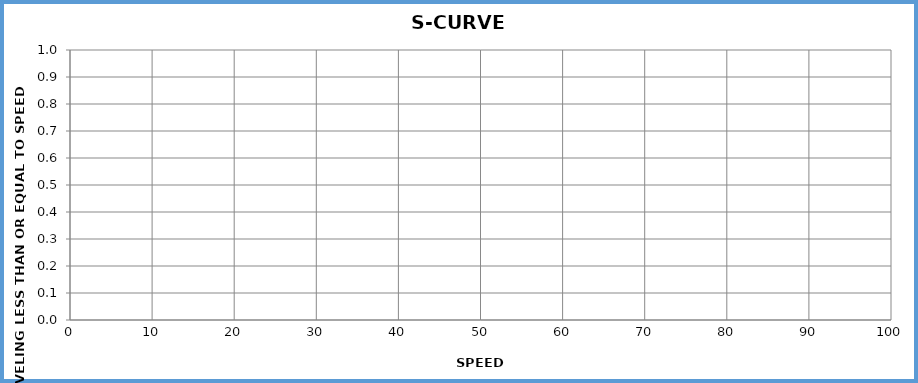
| Category | S-Curve Plot |
|---|---|
| 15.0 | 0 |
| 16.0 | 0 |
| 17.0 | 0 |
| 18.0 | 0 |
| 19.0 | 0 |
| 20.0 | 0 |
| 21.0 | 0 |
| 22.0 | 0 |
| 23.0 | 0 |
| 24.0 | 0 |
| 25.0 | 0 |
| 26.0 | 0 |
| 27.0 | 0 |
| 28.0 | 0 |
| 29.0 | 0 |
| 30.0 | 0 |
| 31.0 | 0 |
| 32.0 | 0 |
| 33.0 | 0 |
| 34.0 | 0 |
| 35.0 | 0 |
| 36.0 | 0 |
| 37.0 | 0 |
| 38.0 | 0 |
| 39.0 | 0 |
| 40.0 | 0 |
| 41.0 | 0 |
| 42.0 | 0 |
| 43.0 | 0 |
| 44.0 | 0 |
| 45.0 | 0 |
| 46.0 | 0 |
| 47.0 | 0 |
| 48.0 | 0 |
| 49.0 | 0 |
| 50.0 | 0 |
| 51.0 | 0 |
| 52.0 | 0 |
| 53.0 | 0 |
| 54.0 | 0 |
| 55.0 | 0 |
| 56.0 | 0 |
| 57.0 | 0 |
| 58.0 | 0 |
| 59.0 | 0 |
| 60.0 | 0 |
| 61.0 | 0 |
| 62.0 | 0 |
| 63.0 | 0 |
| 64.0 | 0 |
| 65.0 | 0 |
| 66.0 | 0 |
| 67.0 | 0 |
| 68.0 | 0 |
| 69.0 | 0 |
| 70.0 | 0 |
| 71.0 | 0 |
| 72.0 | 0 |
| 73.0 | 0 |
| 74.0 | 0 |
| 75.0 | 0 |
| 76.0 | 0 |
| 77.0 | 0 |
| 78.0 | 0 |
| 79.0 | 0 |
| 80.0 | 0 |
| 81.0 | 0 |
| 82.0 | 0 |
| 83.0 | 0 |
| 84.0 | 0 |
| 85.0 | 0 |
| 86.0 | 0 |
| 87.0 | 0 |
| 88.0 | 0 |
| 89.0 | 0 |
| 90.0 | 0 |
| 91.0 | 0 |
| 92.0 | 0 |
| 93.0 | 0 |
| 94.0 | 0 |
| 95.0 | 0 |